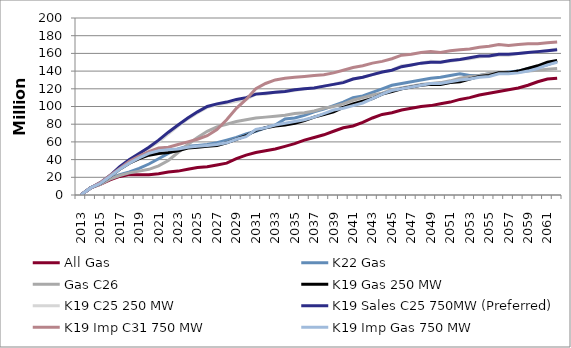
| Category | All Gas | K22 Gas | Gas C26 | K19 Gas 250 MW | K19 C25 250 MW | K19 Sales C25 750MW (Preferred) | K19 Imp C31 750 MW | K19 Imp Gas 750 MW |
|---|---|---|---|---|---|---|---|---|
| 2013.0 | 0 | 0 | 0 | 0 | 0 | 0 | 0 | 0 |
| 2014.0 | 8 | 8 | 8 | 8 | 8 | 8 | 8 | 8 |
| 2015.0 | 12 | 13 | 12 | 13 | 14 | 14 | 14 | 13 |
| 2016.0 | 17 | 19 | 18 | 21 | 22 | 22 | 22 | 21 |
| 2017.0 | 21 | 23 | 22 | 29 | 31 | 32 | 30 | 29 |
| 2018.0 | 23 | 26 | 25 | 36 | 40 | 40 | 38 | 36 |
| 2019.0 | 23 | 30 | 27 | 41 | 47 | 47 | 44 | 42 |
| 2020.0 | 23 | 35 | 29 | 45 | 53 | 54 | 49 | 47 |
| 2021.0 | 24 | 41 | 33 | 47 | 60 | 62 | 53 | 50 |
| 2022.0 | 26 | 47 | 39 | 48 | 69 | 71 | 54 | 51 |
| 2023.0 | 27 | 52 | 48 | 50 | 78 | 79 | 57 | 52 |
| 2024.0 | 29 | 55 | 57 | 53 | 86 | 87 | 60 | 54 |
| 2025.0 | 31 | 56 | 65 | 54 | 93 | 94 | 63 | 55 |
| 2026.0 | 32 | 57 | 72 | 55 | 99 | 100 | 67 | 56 |
| 2027.0 | 34 | 59 | 77 | 56 | 102 | 103 | 74 | 57 |
| 2028.0 | 36 | 62 | 80 | 59 | 104 | 105 | 85 | 59 |
| 2029.0 | 41 | 65 | 83 | 63 | 106 | 108 | 98 | 63 |
| 2030.0 | 45 | 69 | 85 | 67 | 108 | 110 | 108 | 66 |
| 2031.0 | 48 | 72 | 87 | 73 | 114 | 114 | 120 | 74 |
| 2032.0 | 50 | 76 | 88 | 76 | 114 | 115 | 126 | 76 |
| 2033.0 | 52 | 79 | 89 | 78 | 116 | 116 | 130 | 79 |
| 2034.0 | 55 | 86 | 90 | 79 | 117 | 117 | 132 | 81 |
| 2035.0 | 58 | 87 | 92 | 81 | 118 | 119 | 133 | 83 |
| 2036.0 | 62 | 90 | 93 | 84 | 120 | 120 | 134 | 85 |
| 2037.0 | 65 | 94 | 95 | 88 | 121 | 121 | 135 | 88 |
| 2038.0 | 68 | 97 | 98 | 91 | 123 | 123 | 136 | 92 |
| 2039.0 | 72 | 101 | 100 | 94 | 125 | 125 | 138 | 96 |
| 2040.0 | 76 | 105 | 103 | 99 | 128 | 127 | 141 | 98 |
| 2041.0 | 78 | 110 | 107 | 103 | 131 | 131 | 144 | 101 |
| 2042.0 | 82 | 112 | 110 | 106 | 133 | 133 | 146 | 104 |
| 2043.0 | 87 | 116 | 113 | 109 | 136 | 136 | 149 | 109 |
| 2044.0 | 91 | 120 | 115 | 114 | 139 | 139 | 151 | 114 |
| 2045.0 | 93 | 124 | 119 | 117 | 141 | 141 | 154 | 118 |
| 2046.0 | 96 | 126 | 121 | 120 | 146 | 145 | 158 | 120 |
| 2047.0 | 98 | 128 | 123 | 122 | 147 | 147 | 159 | 122 |
| 2048.0 | 100 | 130 | 125 | 124 | 149 | 149 | 161 | 124 |
| 2049.0 | 101 | 132 | 126 | 125 | 151 | 150 | 162 | 126 |
| 2050.0 | 103 | 133 | 127 | 125 | 150 | 150 | 161 | 126 |
| 2051.0 | 105 | 135 | 129 | 127 | 151 | 152 | 163 | 128 |
| 2052.0 | 108 | 137 | 132 | 128 | 153 | 153 | 164 | 130 |
| 2053.0 | 110 | 135 | 134 | 131 | 154 | 155 | 165 | 131 |
| 2054.0 | 113 | 135 | 135 | 134 | 156 | 157 | 167 | 133 |
| 2055.0 | 115 | 137 | 137 | 135 | 157 | 157 | 168 | 134 |
| 2056.0 | 117 | 138 | 138 | 138 | 158 | 159 | 170 | 137 |
| 2057.0 | 119 | 139 | 138 | 138 | 158 | 159 | 169 | 137 |
| 2058.0 | 121 | 140 | 139 | 140 | 160 | 160 | 170 | 138 |
| 2059.0 | 124 | 143 | 140 | 143 | 161 | 161 | 171 | 140 |
| 2060.0 | 128 | 145 | 141 | 146 | 162 | 162 | 171 | 143 |
| 2061.0 | 131 | 147 | 142 | 150 | 163 | 163 | 172 | 147 |
| 2062.0 | 132 | 151 | 143 | 152 | 165 | 164 | 173 | 150 |